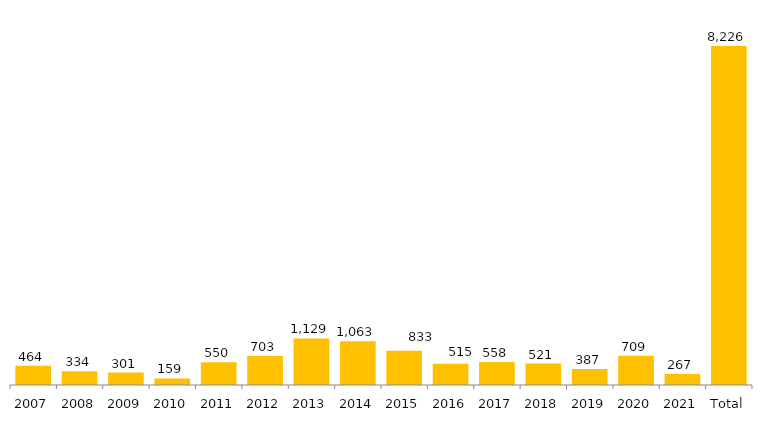
| Category | Total Geral |
|---|---|
| 2007 | 464 |
| 2008 | 334 |
| 2009 | 301 |
| 2010 | 159 |
| 2011 | 550 |
| 2012 | 703 |
| 2013 | 1129 |
| 2014 | 1063 |
| 2015 | 833 |
| 2016 | 515 |
| 2017 | 558 |
| 2018 | 521 |
| 2019 | 387 |
| 2020 | 709 |
| 2021 | 267 |
| Total | 8226 |